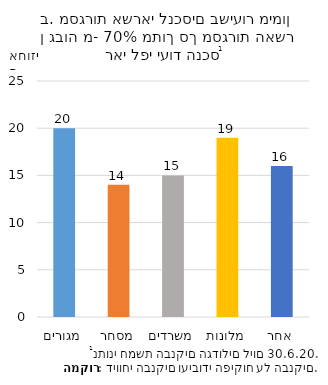
| Category | Series 0 |
|---|---|
| מגורים | 20 |
| מסחר | 14 |
| משרדים | 15 |
| מלונות | 19 |
| אחר | 16 |